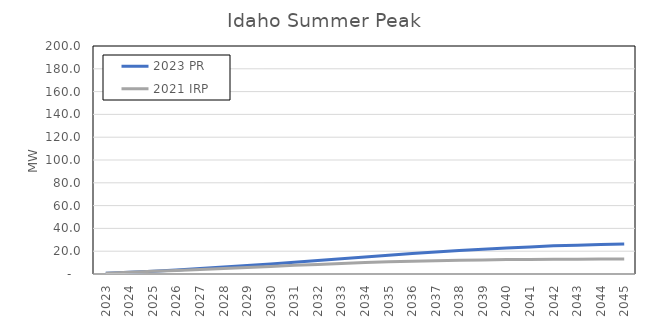
| Category | 2023 PR | 2021 IRP |
|---|---|---|
| 2023.0 | 0.635 | 0.751 |
| 2024.0 | 1.434 | 1.486 |
| 2025.0 | 2.385 | 2.349 |
| 2026.0 | 3.515 | 3.143 |
| 2027.0 | 4.755 | 3.95 |
| 2028.0 | 6.079 | 4.783 |
| 2029.0 | 7.451 | 5.634 |
| 2030.0 | 8.816 | 6.681 |
| 2031.0 | 10.31 | 7.579 |
| 2032.0 | 11.86 | 8.415 |
| 2033.0 | 13.406 | 9.223 |
| 2034.0 | 14.961 | 9.979 |
| 2035.0 | 16.476 | 10.662 |
| 2036.0 | 17.945 | 11.235 |
| 2037.0 | 19.335 | 11.682 |
| 2038.0 | 20.519 | 12.04 |
| 2039.0 | 21.662 | 12.352 |
| 2040.0 | 22.726 | 12.69 |
| 2041.0 | 23.727 | 12.823 |
| 2042.0 | 24.707 | 12.914 |
| 2043.0 | 25.304 | 13.003 |
| 2044.0 | 25.895 | 13.085 |
| 2045.0 | 26.371 | 13.163 |